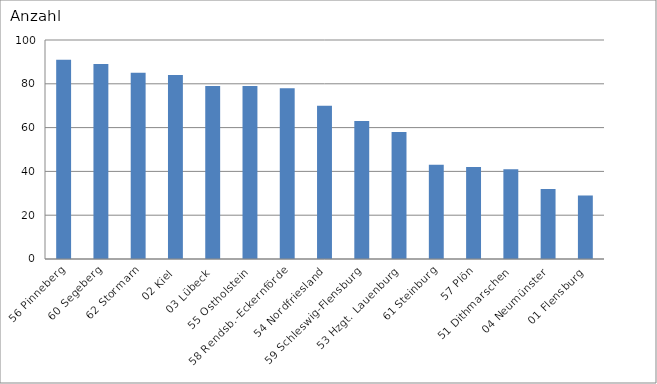
| Category | 56 Pinneberg 60 Segeberg 62 Stormarn 02 Kiel 03 Lübeck 55 Ostholstein 58 Rendsb.-Eckernförde 54 Nordfriesland 59 Schleswig-Flensburg 53 Hzgt. Lauenburg 61 Steinburg 57 Plön 51 Dithmarschen 04 Neumünster 01 Flensburg |
|---|---|
| 56 Pinneberg | 91 |
| 60 Segeberg | 89 |
| 62 Stormarn | 85 |
| 02 Kiel | 84 |
| 03 Lübeck | 79 |
| 55 Ostholstein | 79 |
| 58 Rendsb.-Eckernförde | 78 |
| 54 Nordfriesland | 70 |
| 59 Schleswig-Flensburg | 63 |
| 53 Hzgt. Lauenburg | 58 |
| 61 Steinburg | 43 |
| 57 Plön | 42 |
| 51 Dithmarschen | 41 |
| 04 Neumünster | 32 |
| 01 Flensburg | 29 |